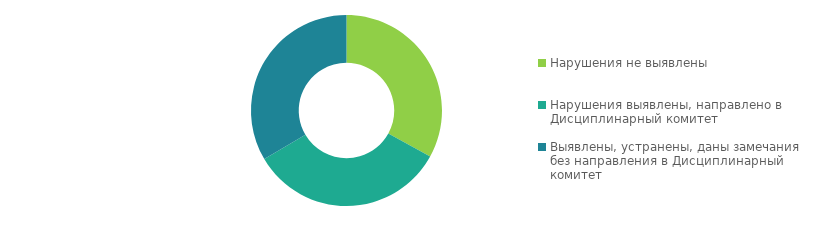
| Category | Series 0 |
|---|---|
| Нарушения не выявлены | 206 |
| Нарушения выявлены, направлено в Дисциплинарный комитет | 209 |
| Выявлены, устранены, даны замечания без направления в Дисциплинарный комитет | 209 |